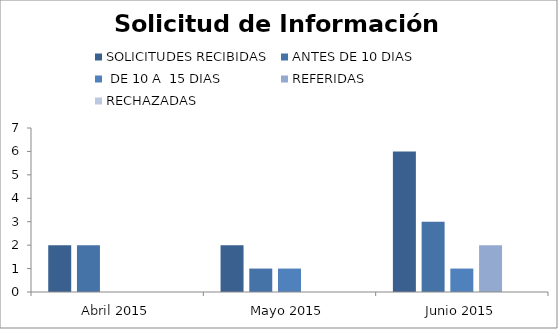
| Category | SOLICITUDES RECIBIDAS | ANTES DE 10 DIAS |  DE 10 A  15 DIAS  | REFERIDAS | RECHAZADAS |
|---|---|---|---|---|---|
| Abril 2015 | 2 | 2 | 0 | 0 | 0 |
| Mayo 2015 | 2 | 1 | 1 | 0 | 0 |
| Junio 2015 | 6 | 3 | 1 | 2 | 0 |